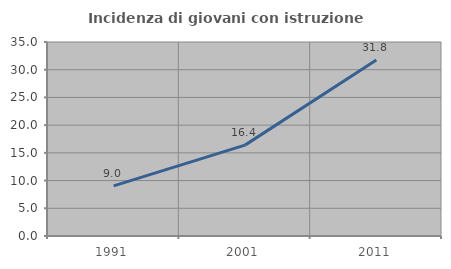
| Category | Incidenza di giovani con istruzione universitaria |
|---|---|
| 1991.0 | 9.032 |
| 2001.0 | 16.393 |
| 2011.0 | 31.757 |